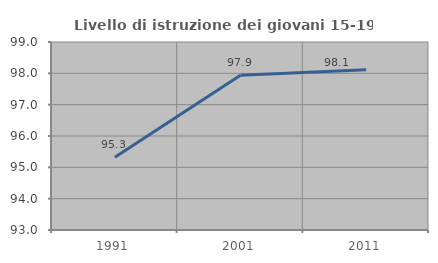
| Category | Livello di istruzione dei giovani 15-19 anni |
|---|---|
| 1991.0 | 95.325 |
| 2001.0 | 97.939 |
| 2011.0 | 98.112 |